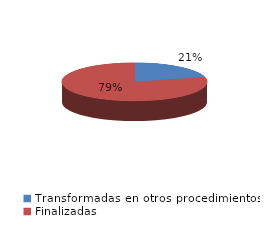
| Category | Series 0 |
|---|---|
| Transformadas en otros procedimientos | 7110 |
| Finalizadas | 27133 |